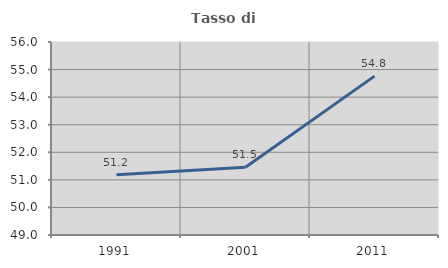
| Category | Tasso di occupazione   |
|---|---|
| 1991.0 | 51.186 |
| 2001.0 | 51.454 |
| 2011.0 | 54.762 |